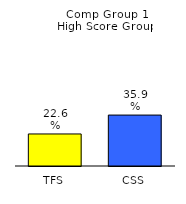
| Category | Series 0 |
|---|---|
| TFS | 0.226 |
| CSS | 0.359 |